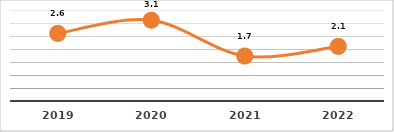
| Category | COBERTURA DE BECADOS EXTERNOS (%)
PRIMER TRIMESTRE, EJERCICIO 2021 |
|---|---|
| 2019.0 | 2.6 |
| 2020.0 | 3.108 |
| 2021.0 | 1.73 |
| 2022.0 | 2.1 |